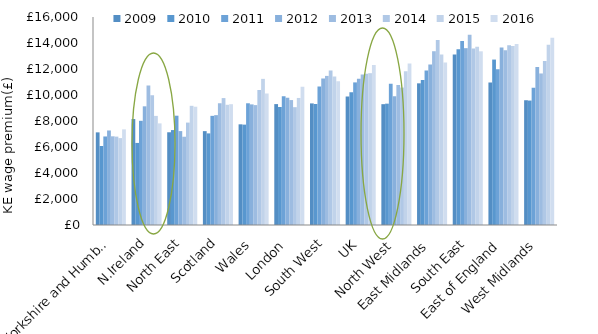
| Category | 2009 | 2010 | 2011 | 2012 | 2013 | 2014 | 2015 | 2016 |
|---|---|---|---|---|---|---|---|---|
| Yorkshire and Humber | 7126 | 6076 | 6810 | 7271 | 6822 | 6798 | 6684 | 7357 |
| N.Ireland | 8151 | 6313 | 8015 | 9129 | 10723 | 9982 | 8392 | 7817 |
| North East | 7133 | 7303 | 8408 | 7223 | 6790 | 7877 | 9168 | 9097 |
| Scotland | 7220 | 7047 | 8396 | 8450 | 9365 | 9763 | 9247 | 9293 |
| Wales | 7744 | 7721 | 9363 | 9277 | 9223 | 10384 | 11241 | 10106 |
| London | 9300 | 9079 | 9900 | 9790 | 9610 | 9063 | 9772 | 10638 |
| South West | 9353 | 9306 | 10658 | 11270 | 11469 | 11882 | 11425 | 11062 |
| UK | 9880 | 10209 | 10969 | 11250 | 11582 | 11629 | 11679 | 12309.153 |
| North West | 9294 | 9334 | 10868 | 9901 | 10762 | 10572 | 11833 | 12417 |
| East Midlands | 10897 | 11145 | 11892 | 12340 | 13367 | 14240 | 13123 | 12494 |
| South East | 13108 | 13527 | 14158 | 13603 | 14643 | 13583 | 13711 | 13361 |
| East of England | 10962 | 12725 | 11983 | 13663 | 13437 | 13828 | 13775 | 13922 |
| West Midlands | 9597 | 9572 | 10554 | 12151 | 11656 | 12611 | 13857 | 14403 |